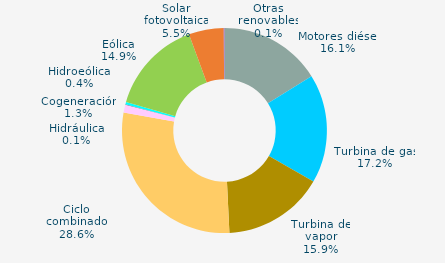
| Category | Series 0 |
|---|---|
| Motores diésel | 16.123 |
| Turbina de gas | 17.185 |
| Turbina de vapor | 15.927 |
| Ciclo combinado | 28.559 |
| Cogeneración | 1.261 |
| Hidráulica | 0.05 |
| Hidroeólica | 0.374 |
| Eólica | 14.884 |
| Solar fotovoltaica | 5.515 |
| Otras renovables | 0.122 |